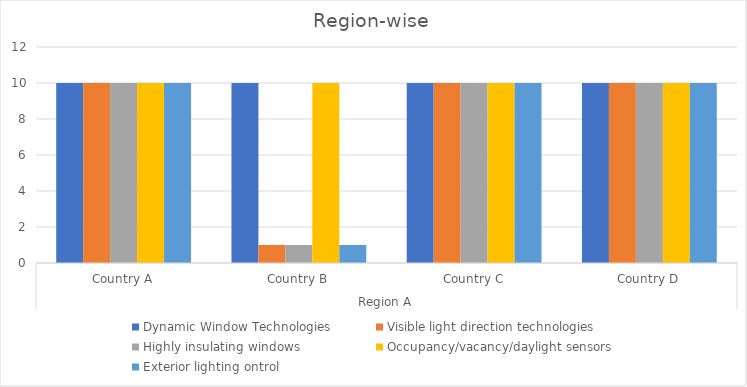
| Category | Dynamic Window Technologies | Visible light direction technologies | Highly insulating windows | Occupancy/vacancy/daylight sensors | Exterior lighting ontrol |
|---|---|---|---|---|---|
| 0 | 10 | 10 | 10 | 10 | 10 |
| 1 | 10 | 1 | 1 | 10 | 1 |
| 2 | 10 | 10 | 10 | 10 | 10 |
| 3 | 10 | 10 | 10 | 10 | 10 |